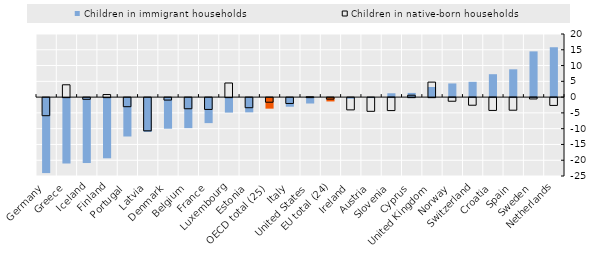
| Category | Children in immigrant households  | Children in native-born households  |
|---|---|---|
| Germany  | -23.758 | -5.732 |
| Greece | -20.724 | 3.907 |
| Iceland | -20.574 | -0.534 |
| Finland | -19.068 | 0.809 |
| Portugal | -12.167 | -2.88 |
| Latvia | -10.711 | -10.526 |
| Denmark | -9.699 | -0.777 |
| Belgium | -9.519 | -3.525 |
| France | -7.925 | -3.745 |
| Luxembourg | -4.595 | 4.473 |
| Estonia | -4.515 | -3.199 |
| OECD total (25) | -3.338 | -1.457 |
| Italy | -2.729 | -1.856 |
| United States | -1.71 | 0.11 |
| EU total (24) | -1.055 | -0.474 |
| Ireland | -0.19 | -3.888 |
| Austria | 0.04 | -4.347 |
| Slovenia | 1.215 | -4.113 |
| Cyprus | 1.331 | 0.603 |
| United Kingdom | 3.208 | 4.758 |
| Norway | 4.331 | -1.152 |
| Switzerland | 4.851 | -2.413 |
| Croatia | 7.26 | -4.063 |
| Spain | 8.812 | -3.994 |
| Sweden | 14.491 | -0.429 |
| Netherlands | 15.803 | -2.476 |